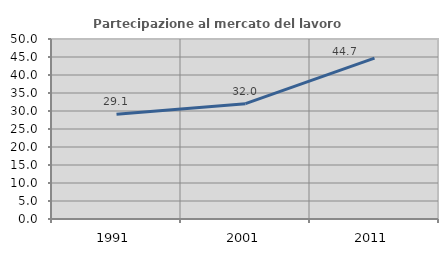
| Category | Partecipazione al mercato del lavoro  femminile |
|---|---|
| 1991.0 | 29.07 |
| 2001.0 | 32.035 |
| 2011.0 | 44.703 |